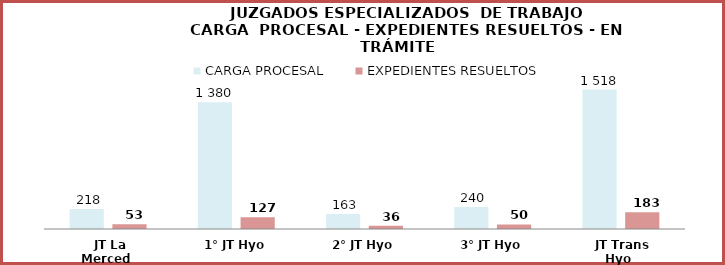
| Category | CARGA PROCESAL | EXPEDIENTES RESUELTOS |
|---|---|---|
| JT La Merced | 218 | 53 |
| 1° JT Hyo | 1380 | 127 |
| 2° JT Hyo | 163 | 36 |
| 3° JT Hyo | 240 | 50 |
| JT Trans Hyo | 1518 | 183 |